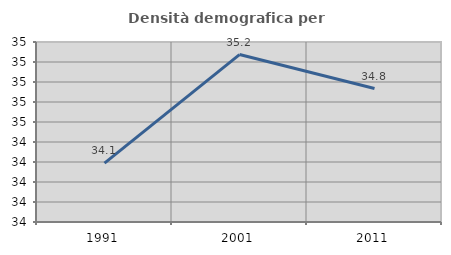
| Category | Densità demografica |
|---|---|
| 1991.0 | 34.089 |
| 2001.0 | 35.174 |
| 2011.0 | 34.835 |